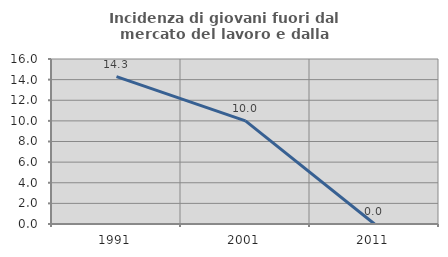
| Category | Incidenza di giovani fuori dal mercato del lavoro e dalla formazione  |
|---|---|
| 1991.0 | 14.286 |
| 2001.0 | 10 |
| 2011.0 | 0 |